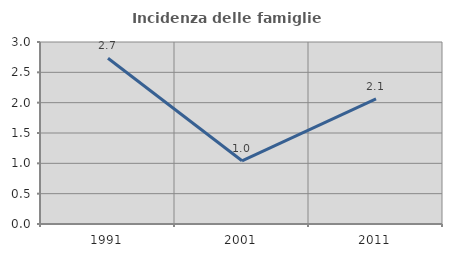
| Category | Incidenza delle famiglie numerose |
|---|---|
| 1991.0 | 2.732 |
| 2001.0 | 1.042 |
| 2011.0 | 2.062 |